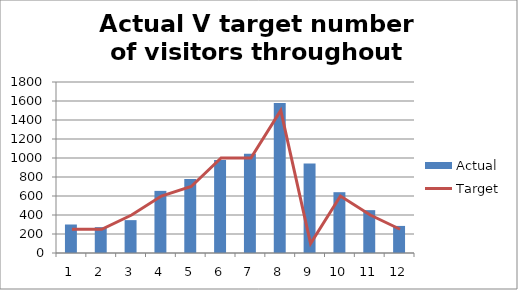
| Category | Actual |
|---|---|
| 0 | 300 |
| 1 | 272 |
| 2 | 346 |
| 3 | 654 |
| 4 | 780 |
| 5 | 980 |
| 6 | 1046 |
| 7 | 1578 |
| 8 | 942 |
| 9 | 640 |
| 10 | 451 |
| 11 | 285 |